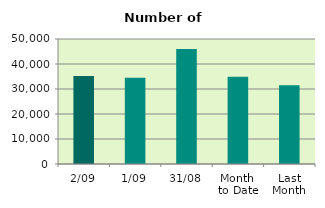
| Category | Series 0 |
|---|---|
| 2/09 | 35168 |
| 1/09 | 34534 |
| 31/08 | 45958 |
| Month 
to Date | 34851 |
| Last
Month | 31456 |